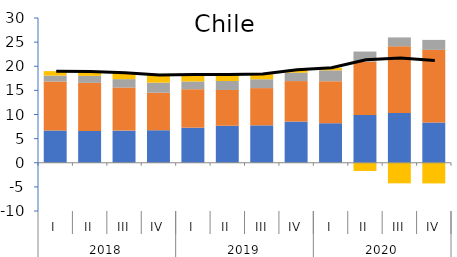
| Category | Hogares e IPSFL | Empresas no financieras | Sociedades financieras | Gobbierno general |
|---|---|---|---|---|
| 0 | 6.69 | 10.139 | 1.239 | 0.92 |
| 1 | 6.594 | 9.966 | 1.446 | 0.906 |
| 2 | 6.669 | 8.91 | 1.75 | 1.321 |
| 3 | 6.741 | 7.767 | 2.093 | 1.588 |
| 4 | 7.276 | 7.966 | 1.616 | 1.434 |
| 5 | 7.668 | 7.411 | 1.868 | 1.321 |
| 6 | 7.754 | 7.719 | 1.837 | 1.089 |
| 7 | 8.537 | 8.393 | 1.733 | 0.59 |
| 8 | 8.193 | 8.708 | 2.258 | 0.528 |
| 9 | 9.883 | 11.072 | 2.09 | -1.704 |
| 10 | 10.32 | 13.8 | 1.855 | -4.266 |
| 11 | 8.346 | 15.05 | 2.068 | -4.285 |